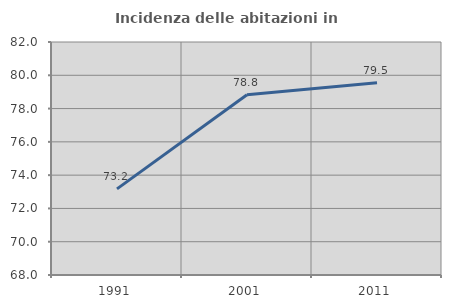
| Category | Incidenza delle abitazioni in proprietà  |
|---|---|
| 1991.0 | 73.174 |
| 2001.0 | 78.833 |
| 2011.0 | 79.545 |